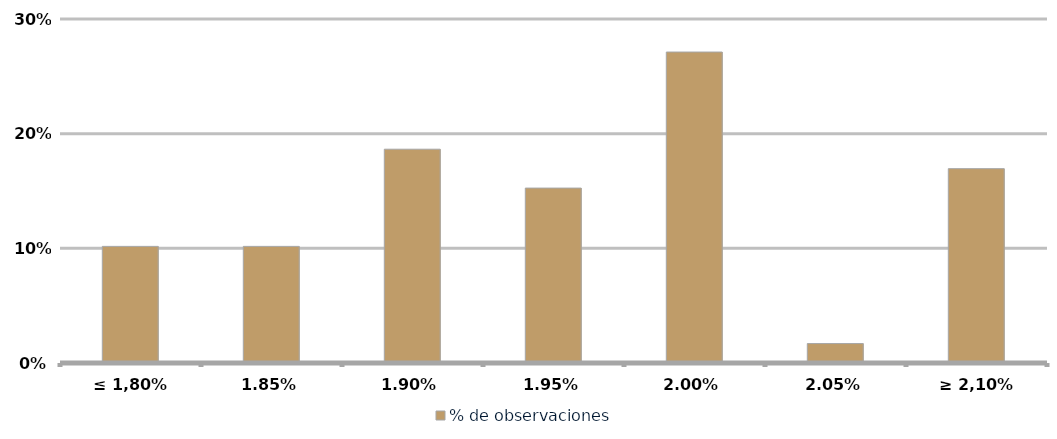
| Category | % de observaciones  |
|---|---|
| ≤ 1,80% | 0.102 |
| 1,85% | 0.102 |
| 1,90% | 0.186 |
| 1,95% | 0.153 |
| 2,00% | 0.271 |
| 2,05% | 0.017 |
| ≥ 2,10% | 0.169 |